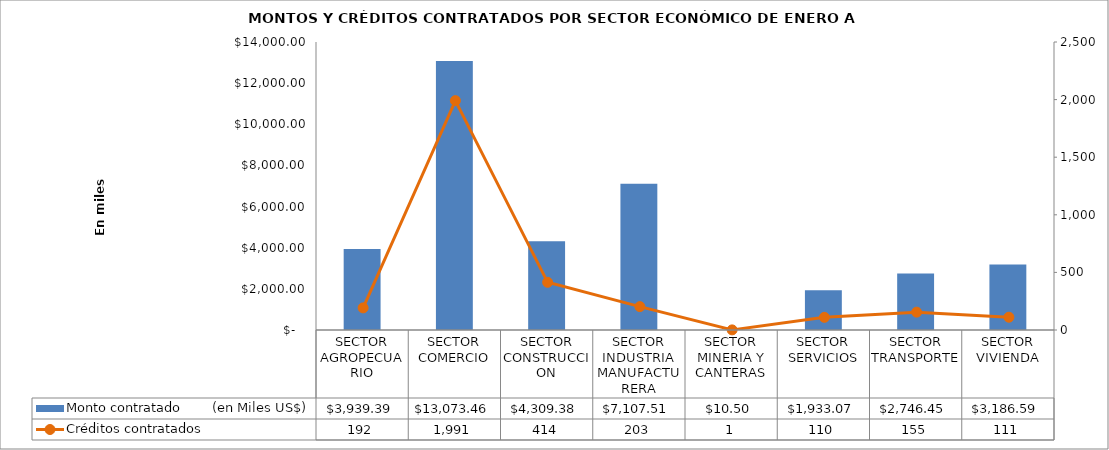
| Category | Monto contratado        (en Miles US$) |
|---|---|
| SECTOR AGROPECUARIO | 3939.39 |
| SECTOR COMERCIO | 13073.461 |
| SECTOR CONSTRUCCION | 4309.382 |
| SECTOR INDUSTRIA MANUFACTURERA | 7107.512 |
| SECTOR MINERIA Y CANTERAS | 10.5 |
| SECTOR SERVICIOS | 1933.072 |
| SECTOR TRANSPORTE | 2746.45 |
| SECTOR VIVIENDA | 3186.592 |